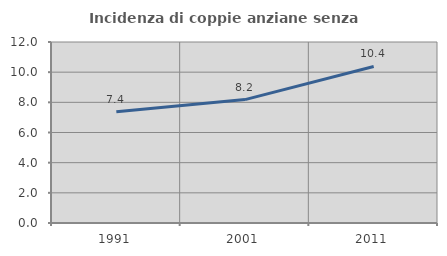
| Category | Incidenza di coppie anziane senza figli  |
|---|---|
| 1991.0 | 7.378 |
| 2001.0 | 8.181 |
| 2011.0 | 10.378 |